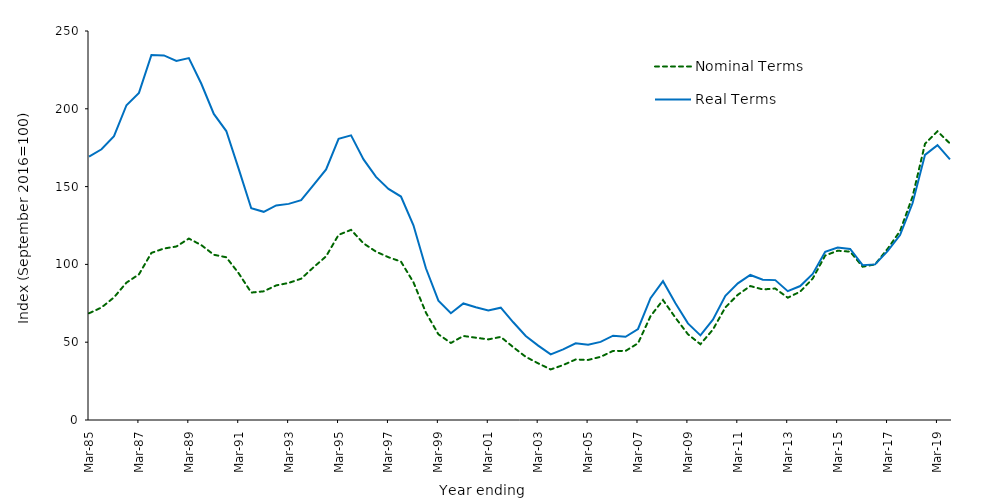
| Category | Nominal Terms | Real Terms |
|---|---|---|
| 1985-03-31 | 68.6 | 169.3 |
| 1985-09-30 | 72.3 | 174 |
| 1986-03-31 | 78.8 | 182.4 |
| 1986-09-30 | 88.3 | 202.3 |
| 1987-03-31 | 93.6 | 210.2 |
| 1987-09-30 | 107.4 | 234.6 |
| 1988-03-31 | 110.2 | 234.3 |
| 1988-09-30 | 111.5 | 230.7 |
| 1989-03-31 | 116.6 | 232.6 |
| 1989-09-30 | 112.4 | 216.1 |
| 1990-03-31 | 106.2 | 196.7 |
| 1990-09-30 | 104.6 | 185.7 |
| 1991-03-31 | 94.2 | 161.2 |
| 1991-09-30 | 81.9 | 136.1 |
| 1992-03-31 | 82.7 | 133.8 |
| 1992-09-30 | 86.5 | 137.9 |
| 1993-03-31 | 88.1 | 138.9 |
| 1993-09-30 | 90.8 | 141.3 |
| 1994-03-31 | 98.2 | 151.1 |
| 1994-09-30 | 105.2 | 161 |
| 1995-03-31 | 119 | 180.7 |
| 1995-09-30 | 122.2 | 182.9 |
| 1996-03-31 | 113.5 | 167.5 |
| 1996-09-30 | 108.2 | 156.2 |
| 1997-03-31 | 104.6 | 148.5 |
| 1997-09-30 | 101.8 | 143.6 |
| 1998-03-31 | 88.5 | 125.1 |
| 1998-09-30 | 69 | 97.5 |
| 1999-03-31 | 55.1 | 76.7 |
| 1999-09-30 | 49.5 | 68.6 |
| 2000-03-31 | 54 | 74.9 |
| 2000-09-30 | 52.9 | 72.5 |
| 2001-03-31 | 51.8 | 70.4 |
| 2001-09-30 | 53.4 | 72.2 |
| 2002-03-31 | 46.8 | 62.8 |
| 2002-09-30 | 40.6 | 54 |
| 2003-03-31 | 36.4 | 47.8 |
| 2003-09-30 | 32.5 | 42.2 |
| 2004-03-31 | 35.3 | 45.4 |
| 2004-09-30 | 38.9 | 49.3 |
| 2005-03-31 | 38.6 | 48.3 |
| 2005-09-30 | 40.6 | 50.2 |
| 2006-03-31 | 44.4 | 54.2 |
| 2006-09-30 | 44.4 | 53.5 |
| 2007-03-31 | 49.3 | 58.5 |
| 2007-09-30 | 66.7 | 78.3 |
| 2008-03-31 | 77.1 | 89.2 |
| 2008-09-30 | 65.7 | 75 |
| 2009-03-31 | 55.1 | 62.1 |
| 2009-09-30 | 48.7 | 54.4 |
| 2010-03-31 | 58.1 | 64.5 |
| 2010-09-30 | 72.4 | 79.8 |
| 2011-03-31 | 80.5 | 87.8 |
| 2011-09-30 | 86.1 | 93.2 |
| 2012-03-31 | 83.9 | 90.2 |
| 2012-09-30 | 84.5 | 89.9 |
| 2013-03-31 | 78.6 | 82.8 |
| 2013-09-30 | 82.5 | 86.1 |
| 2014-03-31 | 90.9 | 93.9 |
| 2014-09-30 | 105.7 | 108.1 |
| 2015-03-31 | 108.8 | 110.9 |
| 2015-09-30 | 108.2 | 109.9 |
| 2016-03-31 | 98.5 | 99.5 |
| 2016-09-30 | 100 | 100 |
| 2017-03-31 | 110 | 108.5 |
| 2017-09-30 | 121.4 | 118.9 |
| 2018-03-31 | 143.5 | 139.3 |
| 2018-09-30 | 177.5 | 170.4 |
| 2019-03-31 | 185.5 | 176.6 |
| 2019-09-30 | 177.7 | 167.5 |